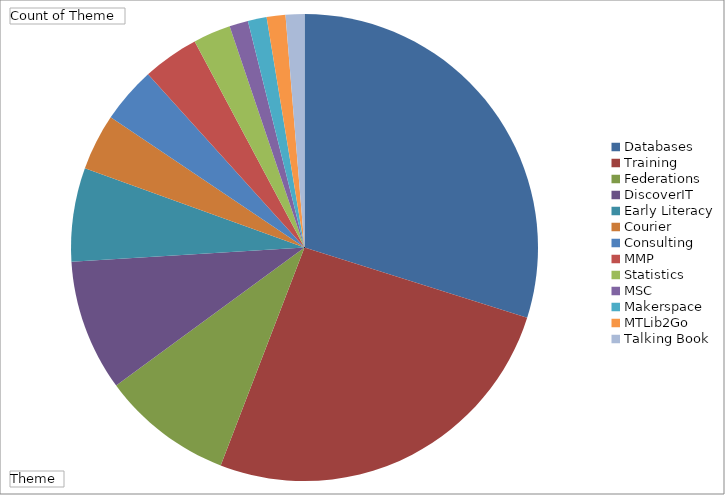
| Category | Total |
|---|---|
| Databases | 23 |
| Training | 20 |
| Federations | 7 |
| DiscoverIT | 7 |
| Early Literacy | 5 |
| Courier | 3 |
| Consulting | 3 |
| MMP | 3 |
| Statistics | 2 |
| MSC | 1 |
| Makerspace | 1 |
| MTLib2Go | 1 |
| Talking Book | 1 |